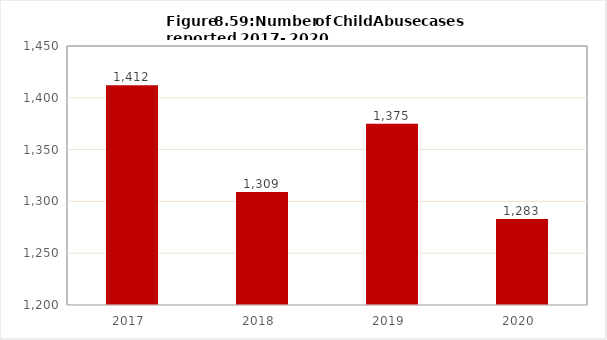
| Category | Series 1 |
|---|---|
| 2017.0 | 1412 |
| 2018.0 | 1309 |
| 2019.0 | 1375 |
| 2020.0 | 1283 |